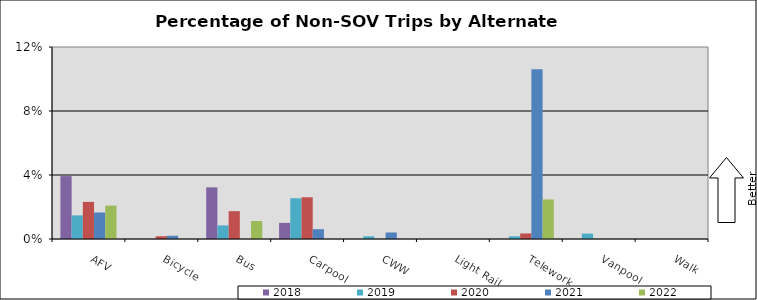
| Category | 2018 | 2019 | 2020 | 2021 | 2022 |
|---|---|---|---|---|---|
| AFV | 0.039 | 0.015 | 0.023 | 0.017 | 0.021 |
| Bicycle | 0 | 0 | 0.002 | 0.002 | 0 |
| Bus | 0.032 | 0.008 | 0.017 | 0 | 0.011 |
| Carpool | 0.01 | 0.025 | 0.026 | 0.006 | 0 |
| CWW | 0 | 0.002 | 0 | 0.004 | 0 |
| Light Rail | 0 | 0 | 0 | 0 | 0 |
| Telework | 0 | 0.002 | 0.003 | 0.106 | 0.025 |
| Vanpool | 0 | 0.003 | 0 | 0 | 0 |
| Walk | 0 | 0 | 0 | 0 | 0 |